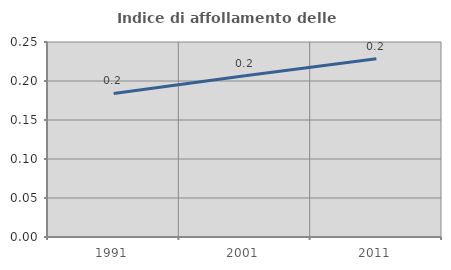
| Category | Indice di affollamento delle abitazioni  |
|---|---|
| 1991.0 | 0.184 |
| 2001.0 | 0.207 |
| 2011.0 | 0.228 |